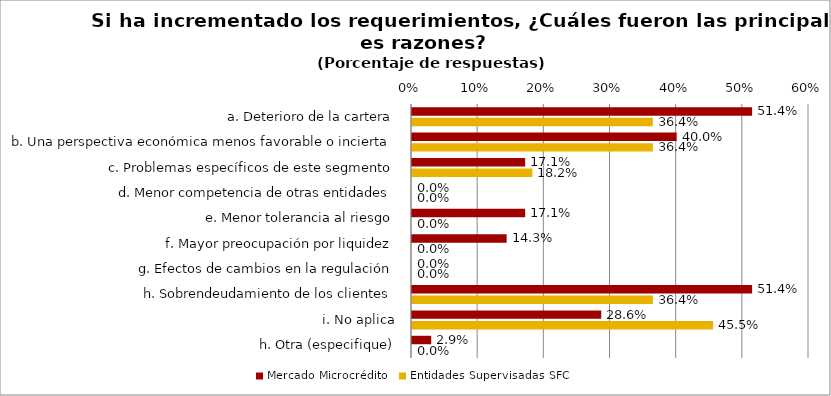
| Category | Mercado Microcrédito | Entidades Supervisadas SFC |
|---|---|---|
| a. Deterioro de la cartera | 0.514 | 0.364 |
| b. Una perspectiva económica menos favorable o incierta | 0.4 | 0.364 |
| c. Problemas específicos de este segmento | 0.171 | 0.182 |
| d. Menor competencia de otras entidades | 0 | 0 |
| e. Menor tolerancia al riesgo | 0.171 | 0 |
| f. Mayor preocupación por liquidez | 0.143 | 0 |
| g. Efectos de cambios en la regulación | 0 | 0 |
| h. Sobrendeudamiento de los clientes | 0.514 | 0.364 |
| i. No aplica | 0.286 | 0.455 |
| h. Otra (especifique) | 0.029 | 0 |